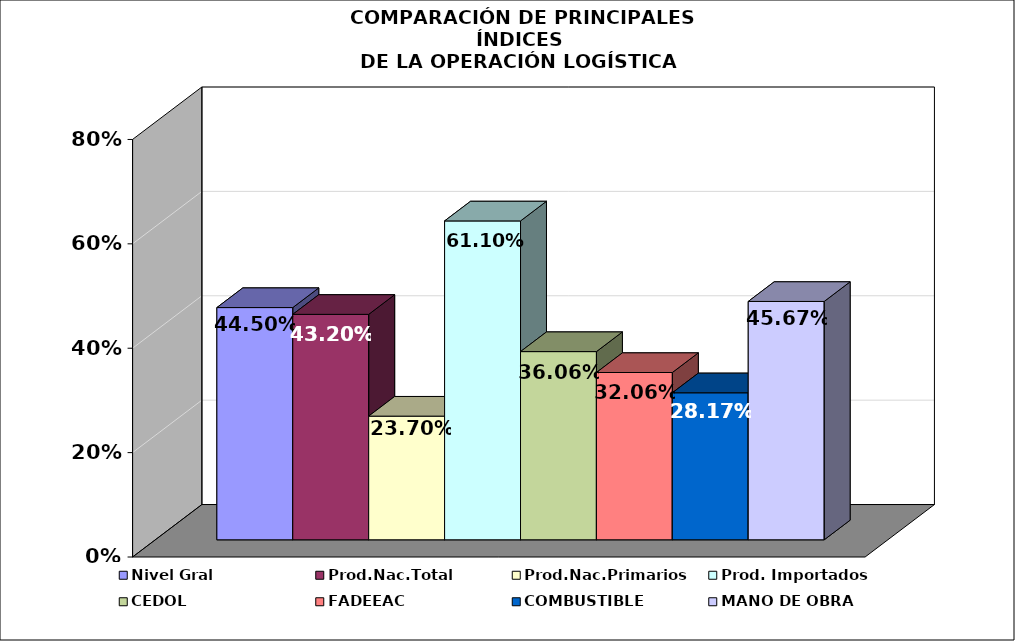
| Category | Nivel Gral | Prod.Nac.Total | Prod.Nac.Primarios | Prod. Importados | CEDOL | FADEEAC | COMBUSTIBLE | MANO DE OBRA |
|---|---|---|---|---|---|---|---|---|
| 0 | 0.445 | 0.432 | 0.237 | 0.611 | 0.361 | 0.321 | 0.282 | 0.457 |